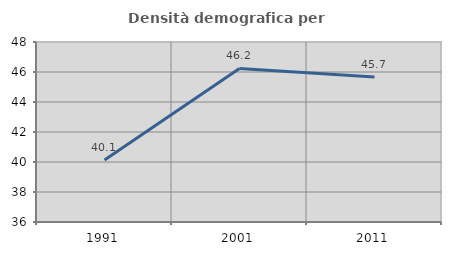
| Category | Densità demografica |
|---|---|
| 1991.0 | 40.133 |
| 2001.0 | 46.238 |
| 2011.0 | 45.674 |